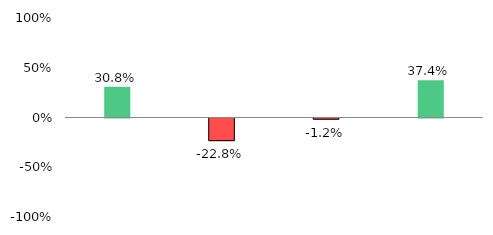
| Category | Variance with Target |
|---|---|
| Absolute Deposit | 0.308 |
| CASA Deposit | -0.228 |
| Average Deposit | -0.012 |
| Weekly Deposit  10-09-2015 | 0.374 |